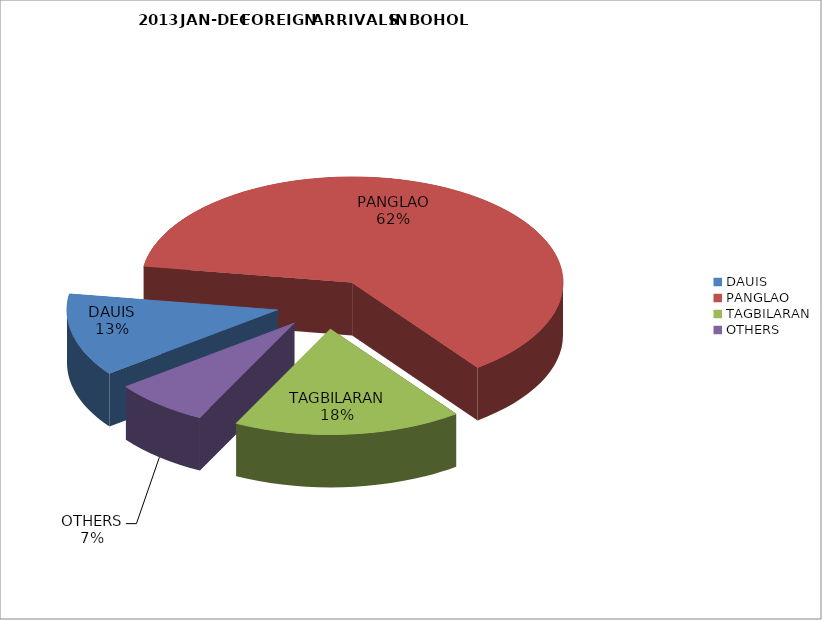
| Category | Series 0 |
|---|---|
| DAUIS | 13787 |
| PANGLAO | 67719 |
| TAGBILARAN | 19016 |
| OTHERS | 7961 |